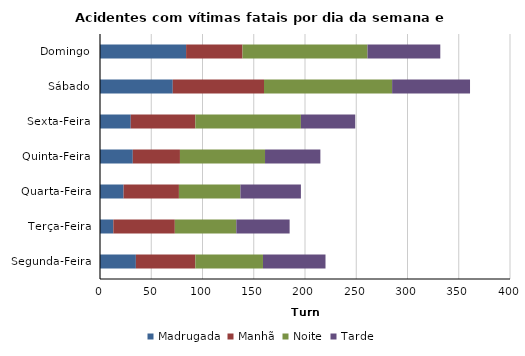
| Category | Madrugada | Manhã | Noite | Tarde |
|---|---|---|---|---|
| Segunda-Feira | 35 | 58 | 66 | 61 |
| Terça-Feira | 13 | 60 | 60 | 52 |
| Quarta-Feira | 23 | 54 | 60 | 59 |
| Quinta-Feira | 32 | 46 | 83 | 54 |
| Sexta-Feira | 30 | 63 | 103 | 53 |
| Sábado | 71 | 89 | 125 | 76 |
| Domingo | 84 | 55 | 122 | 71 |